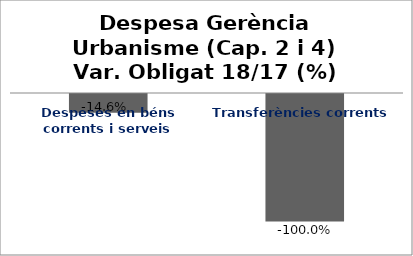
| Category | Series 0 |
|---|---|
| Despeses en béns corrents i serveis | -0.146 |
| Transferències corrents | -1 |